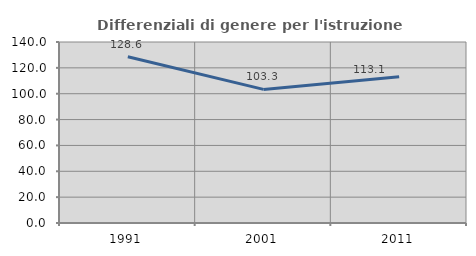
| Category | Differenziali di genere per l'istruzione superiore |
|---|---|
| 1991.0 | 128.616 |
| 2001.0 | 103.328 |
| 2011.0 | 113.094 |